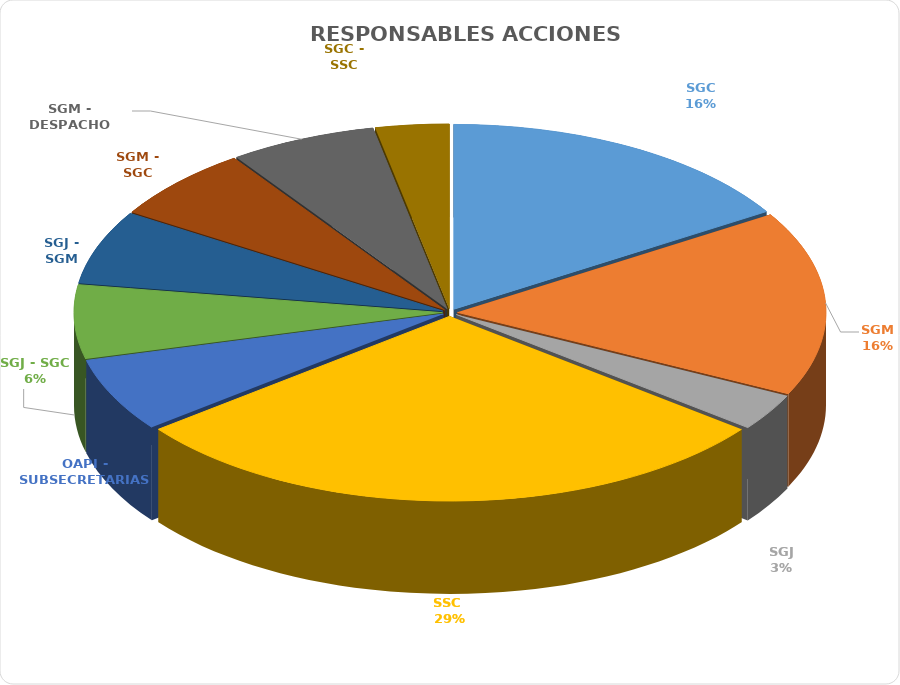
| Category | Series 0 |
|---|---|
| SGC | 5 |
| SGM | 5 |
| SGJ | 1 |
| SSC  | 9 |
| OAPI - SUBSECRETARIAS | 2 |
| SGJ - SGC | 2 |
| SGJ - SGM | 2 |
| SGM - SGC | 2 |
| SGM - DESPACHO | 2 |
| SGC - SSC | 1 |